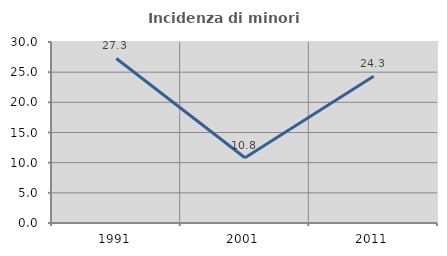
| Category | Incidenza di minori stranieri |
|---|---|
| 1991.0 | 27.273 |
| 2001.0 | 10.811 |
| 2011.0 | 24.318 |